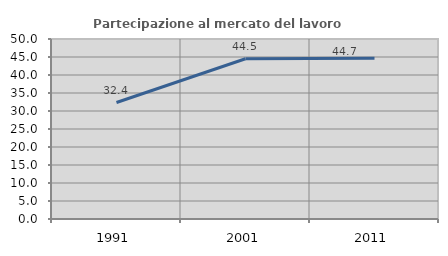
| Category | Partecipazione al mercato del lavoro  femminile |
|---|---|
| 1991.0 | 32.353 |
| 2001.0 | 44.516 |
| 2011.0 | 44.675 |